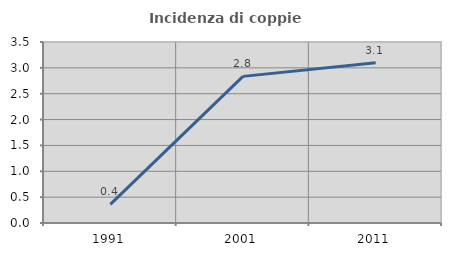
| Category | Incidenza di coppie miste |
|---|---|
| 1991.0 | 0.361 |
| 2001.0 | 2.835 |
| 2011.0 | 3.101 |